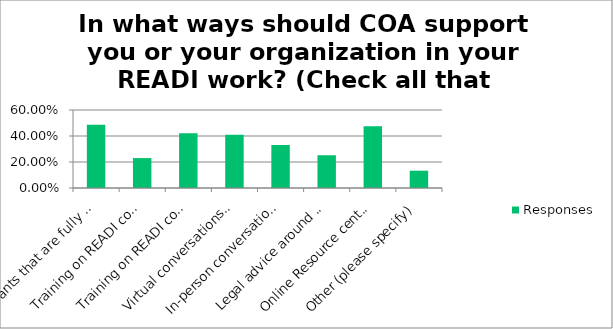
| Category | Responses |
|---|---|
| Grants that are fully or partially scored based on arts and equity, access, diversity and inclusion | 0.486 |
| Training on READI components- in person | 0.23 |
| Training on READI components- via webinar | 0.421 |
| Virtual conversations with artists/arts organizations doing excellent READI programming | 0.41 |
| In-person conversations with artists/arts organizations doing excellent READI programming | 0.331 |
| Legal advice around Equal Opportunity and non-discrimination laws | 0.252 |
| Online Resource center to share READI resources | 0.475 |
| Other (please specify) | 0.133 |